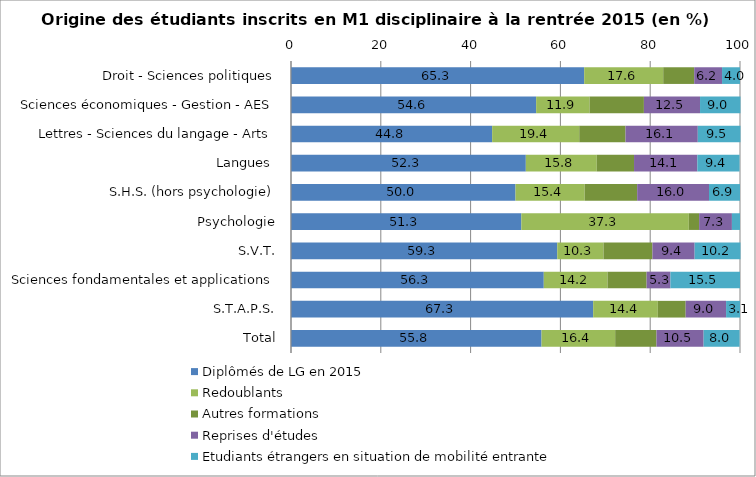
| Category | Diplômés de LG en 2015 | Redoublants | Autres formations | Reprises d'études | Etudiants étrangers en situation de mobilité entrante |
|---|---|---|---|---|---|
| Droit - Sciences politiques | 65.3 | 17.6 | 6.9 | 6.2 | 4 |
| Sciences économiques - Gestion - AES | 54.6 | 11.9 | 12.1 | 12.5 | 9 |
| Lettres - Sciences du langage - Arts | 44.8 | 19.4 | 10.3 | 16.1 | 9.5 |
| Langues  | 52.3 | 15.8 | 8.3 | 14.1 | 9.4 |
| S.H.S. (hors psychologie) | 50 | 15.4 | 11.7 | 16 | 6.9 |
| Psychologie | 51.3 | 37.3 | 2.3 | 7.3 | 1.8 |
| S.V.T. | 59.3 | 10.3 | 10.9 | 9.4 | 10.2 |
| Sciences fondamentales et applications | 56.3 | 14.2 | 8.7 | 5.3 | 15.5 |
| S.T.A.P.S. | 67.3 | 14.4 | 6.2 | 9 | 3.1 |
| Total | 55.8 | 16.4 | 9.2 | 10.5 | 8 |